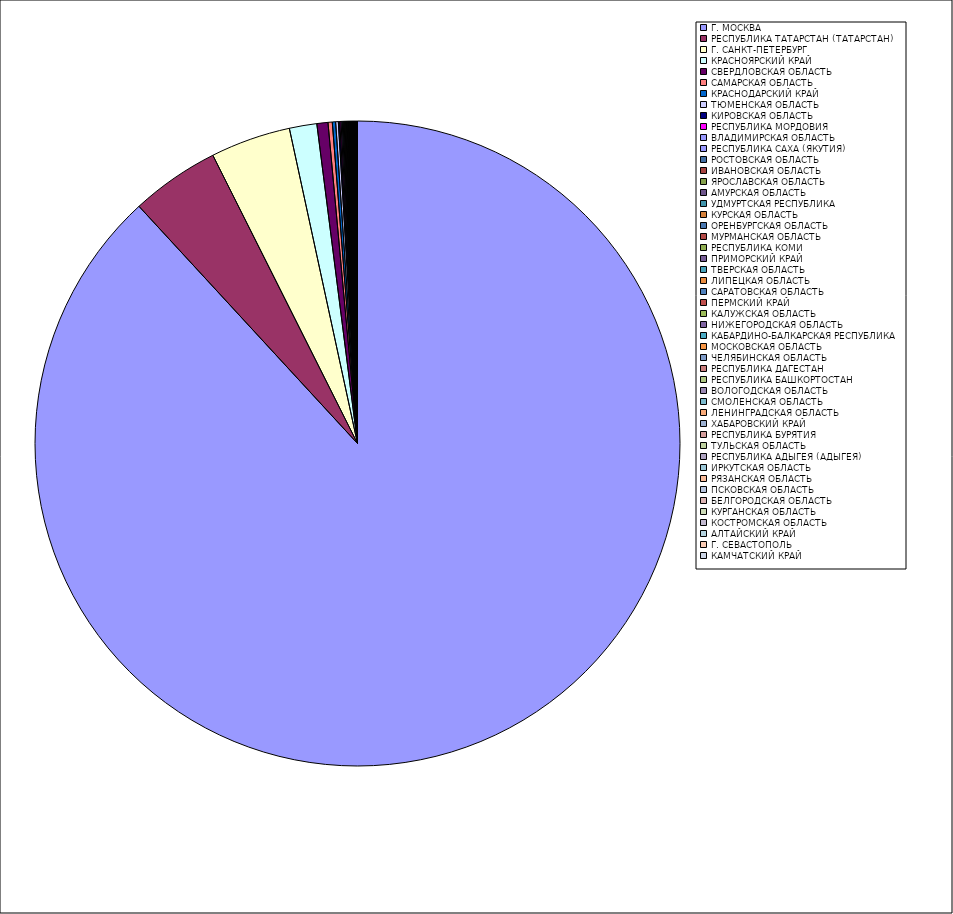
| Category | Оборот |
|---|---|
| Г. МОСКВА | 88.133 |
| РЕСПУБЛИКА ТАТАРСТАН (ТАТАРСТАН) | 4.445 |
| Г. САНКТ-ПЕТЕРБУРГ | 4.012 |
| КРАСНОЯРСКИЙ КРАЙ | 1.375 |
| СВЕРДЛОВСКАЯ ОБЛАСТЬ | 0.555 |
| САМАРСКАЯ ОБЛАСТЬ | 0.212 |
| КРАСНОДАРСКИЙ КРАЙ | 0.165 |
| ТЮМЕНСКАЯ ОБЛАСТЬ | 0.134 |
| КИРОВСКАЯ ОБЛАСТЬ | 0.07 |
| РЕСПУБЛИКА МОРДОВИЯ | 0.063 |
| ВЛАДИМИРСКАЯ ОБЛАСТЬ | 0.057 |
| РЕСПУБЛИКА САХА (ЯКУТИЯ) | 0.048 |
| РОСТОВСКАЯ ОБЛАСТЬ | 0.045 |
| ИВАНОВСКАЯ ОБЛАСТЬ | 0.04 |
| ЯРОСЛАВСКАЯ ОБЛАСТЬ | 0.039 |
| АМУРСКАЯ ОБЛАСТЬ | 0.037 |
| УДМУРТСКАЯ РЕСПУБЛИКА | 0.036 |
| КУРСКАЯ ОБЛАСТЬ | 0.032 |
| ОРЕНБУРГСКАЯ ОБЛАСТЬ | 0.032 |
| МУРМАНСКАЯ ОБЛАСТЬ | 0.031 |
| РЕСПУБЛИКА КОМИ | 0.03 |
| ПРИМОРСКИЙ КРАЙ | 0.029 |
| ТВЕРСКАЯ ОБЛАСТЬ | 0.026 |
| ЛИПЕЦКАЯ ОБЛАСТЬ | 0.025 |
| САРАТОВСКАЯ ОБЛАСТЬ | 0.024 |
| ПЕРМСКИЙ КРАЙ | 0.022 |
| КАЛУЖСКАЯ ОБЛАСТЬ | 0.022 |
| НИЖЕГОРОДСКАЯ ОБЛАСТЬ | 0.02 |
| КАБАРДИНО-БАЛКАРСКАЯ РЕСПУБЛИКА | 0.018 |
| МОСКОВСКАЯ ОБЛАСТЬ | 0.017 |
| ЧЕЛЯБИНСКАЯ ОБЛАСТЬ | 0.017 |
| РЕСПУБЛИКА ДАГЕСТАН | 0.016 |
| РЕСПУБЛИКА БАШКОРТОСТАН | 0.015 |
| ВОЛОГОДСКАЯ ОБЛАСТЬ | 0.013 |
| СМОЛЕНСКАЯ ОБЛАСТЬ | 0.012 |
| ЛЕНИНГРАДСКАЯ ОБЛАСТЬ | 0.012 |
| ХАБАРОВСКИЙ КРАЙ | 0.011 |
| РЕСПУБЛИКА БУРЯТИЯ | 0.01 |
| ТУЛЬСКАЯ ОБЛАСТЬ | 0.01 |
| РЕСПУБЛИКА АДЫГЕЯ (АДЫГЕЯ) | 0.009 |
| ИРКУТСКАЯ ОБЛАСТЬ | 0.009 |
| РЯЗАНСКАЯ ОБЛАСТЬ | 0.009 |
| ПСКОВСКАЯ ОБЛАСТЬ | 0.009 |
| БЕЛГОРОДСКАЯ ОБЛАСТЬ | 0.006 |
| КУРГАНСКАЯ ОБЛАСТЬ | 0.006 |
| КОСТРОМСКАЯ ОБЛАСТЬ | 0.006 |
| АЛТАЙСКИЙ КРАЙ | 0.006 |
| Г. СЕВАСТОПОЛЬ | 0.005 |
| КАМЧАТСКИЙ КРАЙ | 0.005 |